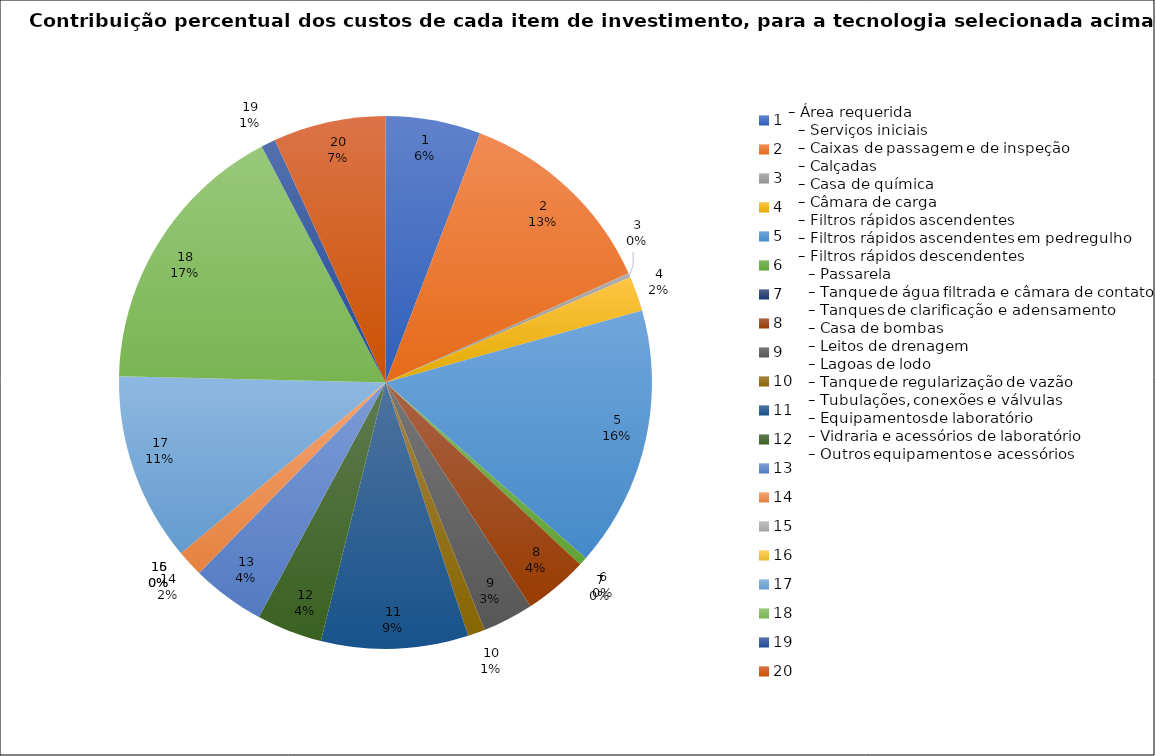
| Category | DF - ETR1 0 |
|---|---|
| 1.0 | 66366.3 |
| 2.0 | 143991.687 |
| 3.0 | 2989.708 |
| 4.0 | 24266.568 |
| 5.0 | 181903.578 |
| 6.0 | 5742.818 |
| 7.0 | 0 |
| 8.0 | 44729.342 |
| 9.0 | 35530.656 |
| 10.0 | 12000.382 |
| 11.0 | 102601.768 |
| 12.0 | 45788.879 |
| 13.0 | 51215.079 |
| 14.0 | 18456.831 |
| 15.0 | 0 |
| 16.0 | 0 |
| 17.0 | 131604.34 |
| 18.0 | 194904.93 |
| 19.0 | 10067.74 |
| 20.0 | 78371.68 |